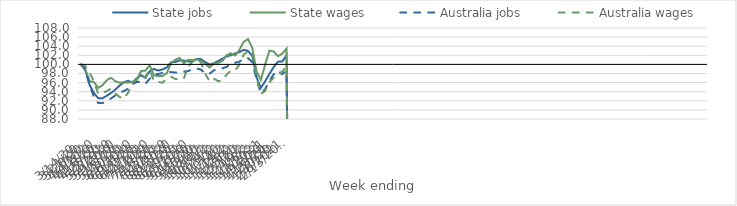
| Category | State jobs | State wages | Australia jobs | Australia wages |
|---|---|---|---|---|
| 14/03/2020 | 100 | 100 | 100 | 100 |
| 21/03/2020 | 98.651 | 98.834 | 98.956 | 99.592 |
| 28/03/2020 | 95.443 | 96.298 | 95.411 | 98.113 |
| 04/04/2020 | 93.685 | 96.098 | 92.812 | 96.235 |
| 11/04/2020 | 92.565 | 94.821 | 91.52 | 93.527 |
| 18/04/2020 | 92.551 | 95.429 | 91.496 | 93.723 |
| 25/04/2020 | 93.111 | 96.535 | 92.021 | 94.131 |
| 02/05/2020 | 93.729 | 97.083 | 92.516 | 94.682 |
| 09/05/2020 | 94.461 | 96.278 | 93.196 | 93.605 |
| 16/05/2020 | 95.356 | 95.988 | 93.786 | 92.839 |
| 23/05/2020 | 96.085 | 96.044 | 94.144 | 92.494 |
| 30/05/2020 | 96.394 | 96.001 | 94.649 | 93.8 |
| 06/06/2020 | 95.991 | 96.196 | 95.633 | 95.98 |
| 13/06/2020 | 96.938 | 96.57 | 96.135 | 96.637 |
| 20/06/2020 | 97.639 | 98.543 | 96.155 | 97.543 |
| 27/06/2020 | 97.022 | 98.628 | 95.736 | 97.22 |
| 04/07/2020 | 98.489 | 99.804 | 96.811 | 98.854 |
| 11/07/2020 | 99.005 | 97.574 | 97.797 | 96.324 |
| 18/07/2020 | 98.65 | 97.449 | 97.892 | 96.165 |
| 25/07/2020 | 98.884 | 97.448 | 98.105 | 95.98 |
| 01/08/2020 | 99.335 | 98.061 | 98.318 | 96.817 |
| 08/08/2020 | 100.468 | 100.229 | 98.31 | 97.297 |
| 15/08/2020 | 100.532 | 101.034 | 98.2 | 96.802 |
| 22/08/2020 | 100.88 | 101.411 | 98.249 | 96.652 |
| 29/08/2020 | 100.844 | 100.237 | 98.38 | 96.868 |
| 05/09/2020 | 100.656 | 101.012 | 98.54 | 99.571 |
| 12/09/2020 | 100.641 | 100.916 | 98.935 | 100.548 |
| 19/09/2020 | 101.216 | 101.103 | 99.081 | 101.275 |
| 26/09/2020 | 101.147 | 100.787 | 98.859 | 100.413 |
| 03/10/2020 | 100.529 | 100.127 | 97.958 | 97.98 |
| 10/10/2020 | 99.941 | 99.31 | 97.945 | 96.303 |
| 17/10/2020 | 100.242 | 100.197 | 98.678 | 96.878 |
| 24/10/2020 | 100.728 | 100.3 | 98.932 | 96.325 |
| 31/10/2020 | 101.241 | 100.742 | 99.127 | 96.446 |
| 07/11/2020 | 101.759 | 102.016 | 99.458 | 97.753 |
| 14/11/2020 | 102.012 | 102.446 | 100.12 | 98.654 |
| 21/11/2020 | 102.411 | 101.954 | 100.358 | 98.686 |
| 28/11/2020 | 102.694 | 103.198 | 100.609 | 100.004 |
| 05/12/2020 | 103.198 | 104.982 | 101.271 | 102.199 |
| 12/12/2020 | 102.966 | 105.553 | 101.353 | 102.847 |
| 19/12/2020 | 101.862 | 103.594 | 100.515 | 102.738 |
| 26/12/2020 | 97.141 | 98.435 | 96.696 | 97.23 |
| 02/01/2021 | 94.842 | 96.591 | 93.609 | 93.51 |
| 09/01/2021 | 96.283 | 99.946 | 94.526 | 94.153 |
| 16/01/2021 | 97.906 | 103.022 | 96.434 | 96.036 |
| 23/01/2021 | 99.411 | 102.839 | 97.839 | 97.148 |
| 30/01/2021 | 100.604 | 101.786 | 98.639 | 97.559 |
| 06/02/2021 | 100.63 | 102.356 | 97.828 | 98.431 |
| 13/02/2021 | 102.024 | 103.484 | 98.686 | 99.61 |